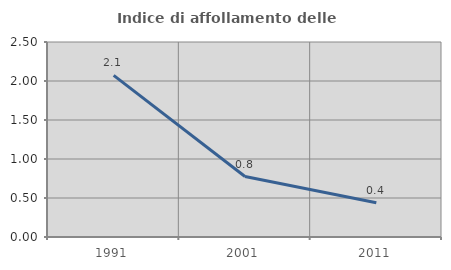
| Category | Indice di affollamento delle abitazioni  |
|---|---|
| 1991.0 | 2.072 |
| 2001.0 | 0.775 |
| 2011.0 | 0.439 |